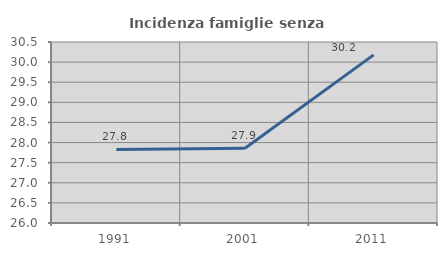
| Category | Incidenza famiglie senza nuclei |
|---|---|
| 1991.0 | 27.827 |
| 2001.0 | 27.858 |
| 2011.0 | 30.179 |